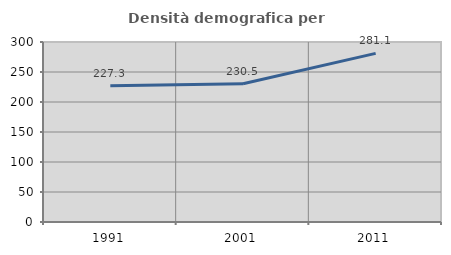
| Category | Densità demografica |
|---|---|
| 1991.0 | 227.287 |
| 2001.0 | 230.544 |
| 2011.0 | 281.078 |